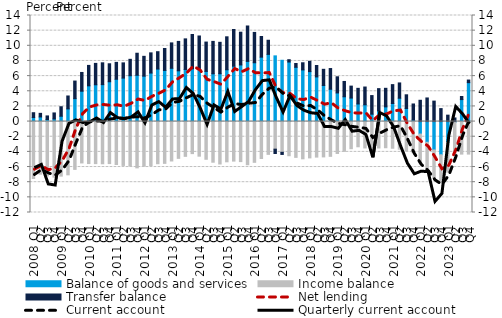
| Category | Balance of goods and services | Income balance | Transfer balance |
|---|---|---|---|
| 2008 Q1 | 0.541 | -7.513 | 0.629 |
| Q2 | 0.609 | -6.945 | 0.477 |
| Q3 | 0.273 | -7.172 | 0.473 |
| Q4 | 0.346 | -7.33 | 0.793 |
| 2009 Q1 | 0.706 | -7.199 | 1.252 |
| Q2 | 1.676 | -7.027 | 1.702 |
| Q3 | 3.028 | -6.31 | 2.319 |
| Q4 | 4.008 | -5.461 | 2.475 |
| 2010 Q1 | 4.718 | -5.542 | 2.696 |
| Q2 | 4.856 | -5.548 | 2.822 |
| Q3 | 4.875 | -5.569 | 2.881 |
| Q4 | 5.259 | -5.545 | 2.37 |
| 2011 Q1 | 5.584 | -5.666 | 2.229 |
| Q2 | 5.738 | -5.787 | 2.01 |
| Q3 | 6.051 | -5.869 | 2.165 |
| Q4 | 6.114 | -6.109 | 2.905 |
| 2012 Q1 | 5.99 | -5.885 | 2.621 |
| Q2 | 6.405 | -5.809 | 2.664 |
| Q3 | 6.932 | -5.562 | 2.291 |
| Q4 | 6.749 | -5.515 | 2.895 |
| 2013 Q1 | 7.032 | -5.201 | 3.352 |
| Q2 | 6.701 | -4.855 | 3.878 |
| Q3 | 6.881 | -4.589 | 4.034 |
| Q4 | 6.971 | -4.23 | 4.522 |
| 2014 Q1 | 7.036 | -4.566 | 4.26 |
| Q2 | 6.623 | -4.977 | 3.871 |
| Q3 | 6.307 | -5.364 | 4.275 |
| Q4 | 6.316 | -5.599 | 4.145 |
| 2015 Q1 | 6.838 | -5.309 | 4.35 |
| Q2 | 7.308 | -5.216 | 4.842 |
| Q3 | 7.477 | -5.283 | 4.32 |
| Q4 | 7.943 | -5.693 | 4.673 |
| 2016 Q1 | 7.764 | -5.377 | 4.002 |
| Q2 | 8.503 | -4.87 | 2.723 |
| Q3 | 8.868 | -4.329 | 1.866 |
| Q4 | 8.672 | -3.641 | -0.569 |
| 2017 Q1 | 8.089 | -4.054 | -0.284 |
| Q2 | 7.862 | -4.508 | 0.303 |
| Q3 | 7.163 | -4.725 | 0.502 |
| Q4 | 6.82 | -4.916 | 0.941 |
| 2018 Q1 | 6.595 | -4.794 | 1.358 |
| Q2 | 5.894 | -4.689 | 1.507 |
| Q3 | 4.759 | -4.663 | 2.139 |
| Q4 | 4.267 | -4.589 | 2.734 |
| 2019 Q1 | 3.779 | -4.209 | 2.133 |
| Q2 | 3.274 | -3.932 | 2.02 |
| Q3 | 3.104 | -3.581 | 1.576 |
| Q4 | 2.324 | -3.326 | 2.062 |
| 2020 Q1 | 2.215 | -3.484 | 2.346 |
| Q2 | 0.977 | -3.362 | 2.454 |
| Q3 | 1.407 | -3.484 | 2.94 |
| Q4 | 1.938 | -3.452 | 2.452 |
| 2021 Q1 | 2.386 | -3.52 | 2.49 |
| Q2 | 3.082 | -3.646 | 2.018 |
| Q3 | 1.721 | -3.862 | 1.813 |
| Q4 | 0.203 | -4.107 | 2.119 |
| 2022 Q1 | -1.65 | -3.823 | 2.81 |
| Q2 | -2.731 | -3.68 | 3.117 |
| Q3 | -3.749 | -3.683 | 2.701 |
| Q4 | -4.383 | -3.621 | 1.713 |
| 2023 Q1 | -2.752 | -3.92 | 0.847 |
| Q2 | -0.106 | -4.169 | 0.479 |
| Q3 | 2.903 | -4.293 | 0.405 |
| Q4 | 5.136 | -4.29 | 0.343 |